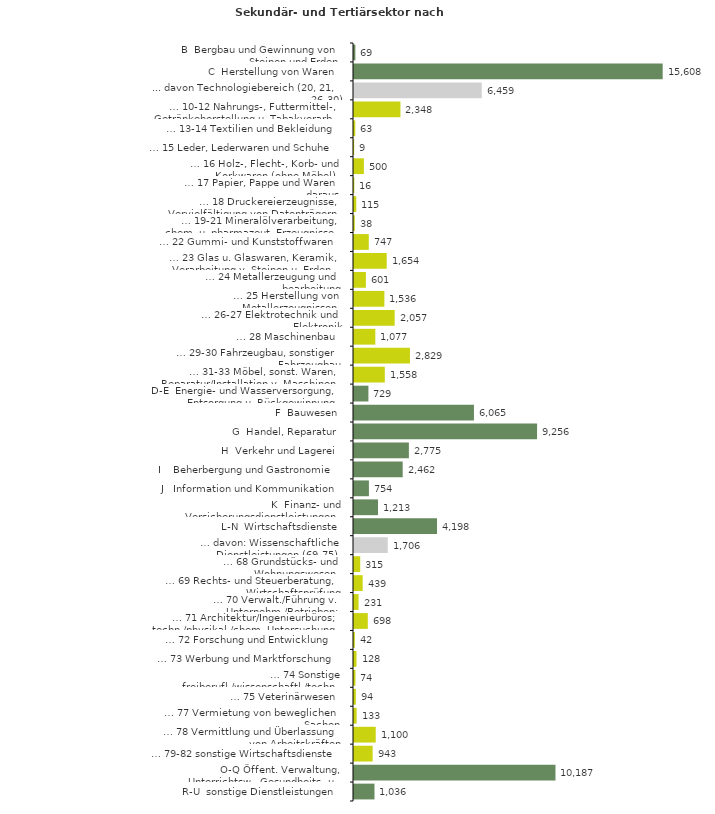
| Category | Series 0 |
|---|---|
| B  Bergbau und Gewinnung von Steinen und Erden | 69 |
| C  Herstellung von Waren | 15608 |
| ... davon Technologiebereich (20, 21, 26-30) | 6459 |
| … 10-12 Nahrungs-, Futtermittel-, Getränkeherstellung u. Tabakverarb. | 2348 |
| … 13-14 Textilien und Bekleidung | 63 |
| … 15 Leder, Lederwaren und Schuhe | 9 |
| … 16 Holz-, Flecht-, Korb- und Korkwaren (ohne Möbel)  | 500 |
| … 17 Papier, Pappe und Waren daraus  | 16 |
| … 18 Druckereierzeugnisse, Vervielfältigung von Datenträgern | 115 |
| … 19-21 Mineralölverarbeitung, chem. u. pharmazeut. Erzeugnisse | 38 |
| … 22 Gummi- und Kunststoffwaren | 747 |
| … 23 Glas u. Glaswaren, Keramik, Verarbeitung v. Steinen u. Erden  | 1654 |
| … 24 Metallerzeugung und -bearbeitung | 601 |
| … 25 Herstellung von Metallerzeugnissen  | 1536 |
| … 26-27 Elektrotechnik und Elektronik | 2057 |
| … 28 Maschinenbau | 1077 |
| … 29-30 Fahrzeugbau, sonstiger Fahrzeugbau | 2829 |
| … 31-33 Möbel, sonst. Waren, Reparatur/Installation v. Maschinen | 1558 |
| D-E  Energie- und Wasserversorgung, Entsorgung u. Rückgewinnung | 729 |
| F  Bauwesen | 6065 |
| G  Handel, Reparatur | 9256 |
| H  Verkehr und Lagerei | 2775 |
| I    Beherbergung und Gastronomie | 2462 |
| J   Information und Kommunikation | 754 |
| K  Finanz- und Versicherungsdienstleistungen | 1213 |
| L-N  Wirtschaftsdienste | 4198 |
| … davon: Wissenschaftliche Dienstleistungen (69-75) | 1706 |
| … 68 Grundstücks- und Wohnungswesen  | 315 |
| … 69 Rechts- und Steuerberatung, Wirtschaftsprüfung | 439 |
| … 70 Verwalt./Führung v. Unternehm./Betrieben; Unternehmensberat. | 231 |
| … 71 Architektur/Ingenieurbüros; techn./physikal./chem. Untersuchung | 698 |
| … 72 Forschung und Entwicklung  | 42 |
| … 73 Werbung und Marktforschung | 128 |
| … 74 Sonstige freiberufl./wissenschaftl./techn. Tätigkeiten | 74 |
| … 75 Veterinärwesen | 94 |
| … 77 Vermietung von beweglichen Sachen  | 133 |
| … 78 Vermittlung und Überlassung von Arbeitskräften | 1100 |
| … 79-82 sonstige Wirtschaftsdienste | 943 |
| O-Q Öffent. Verwaltung, Unterrichtsw., Gesundheits- u. Sozialwesen | 10187 |
| R-U  sonstige Dienstleistungen | 1036 |